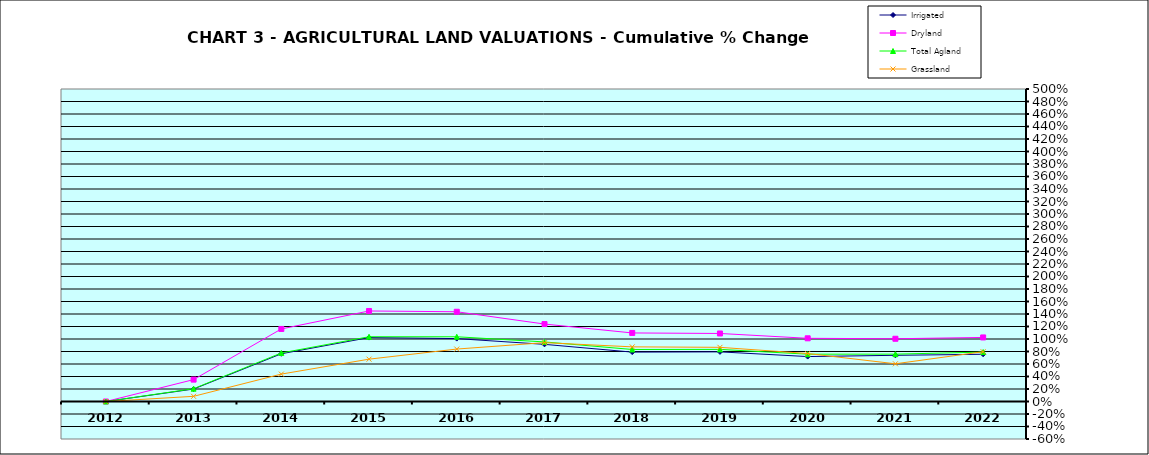
| Category | Irrigated | Dryland | Total Agland | Grassland |
|---|---|---|---|---|
| 2012.0 | 0 | 0 | 0 | 0 |
| 2013.0 | 0.199 | 0.35 | 0.205 | 0.083 |
| 2014.0 | 0.764 | 1.161 | 0.777 | 0.438 |
| 2015.0 | 1.023 | 1.448 | 1.036 | 0.677 |
| 2016.0 | 1.006 | 1.436 | 1.036 | 0.839 |
| 2017.0 | 0.914 | 1.239 | 0.953 | 0.941 |
| 2018.0 | 0.79 | 1.097 | 0.832 | 0.874 |
| 2019.0 | 0.794 | 1.088 | 0.834 | 0.867 |
| 2020.0 | 0.719 | 1.011 | 0.757 | 0.768 |
| 2021.0 | 0.739 | 1.004 | 0.758 | 0.603 |
| 2022.0 | 0.756 | 1.025 | 0.791 | 0.796 |